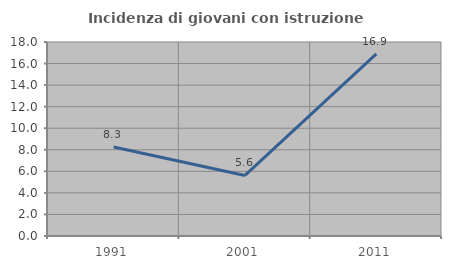
| Category | Incidenza di giovani con istruzione universitaria |
|---|---|
| 1991.0 | 8.264 |
| 2001.0 | 5.618 |
| 2011.0 | 16.889 |